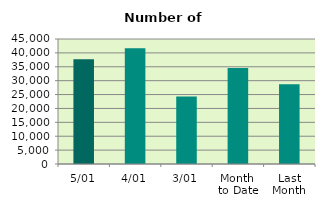
| Category | Series 0 |
|---|---|
| 5/01 | 37712 |
| 4/01 | 41702 |
| 3/01 | 24340 |
| Month 
to Date | 34584.667 |
| Last
Month | 28724.435 |